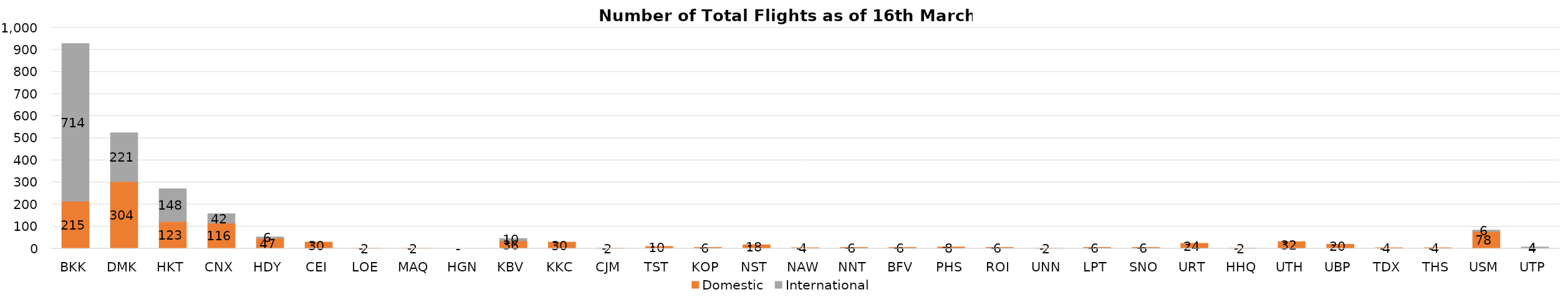
| Category | Domestic | International |
|---|---|---|
| BKK | 215 | 714 |
| DMK | 304 | 221 |
| HKT | 123 | 148 |
| CNX | 116 | 42 |
| HDY | 47 | 6 |
| CEI | 30 | 0 |
| LOE | 2 | 0 |
| MAQ | 2 | 0 |
| HGN | 0 | 0 |
| KBV | 36 | 10 |
| KKC | 30 | 0 |
| CJM | 2 | 0 |
| TST | 10 | 0 |
| KOP | 6 | 0 |
| NST | 18 | 0 |
| NAW | 4 | 0 |
| NNT | 6 | 0 |
| BFV | 6 | 0 |
| PHS | 8 | 0 |
| ROI | 6 | 0 |
| UNN | 2 | 0 |
| LPT | 6 | 0 |
| SNO | 6 | 0 |
| URT | 24 | 0 |
| HHQ | 2 | 0 |
| UTH | 32 | 0 |
| UBP | 20 | 0 |
| TDX | 4 | 0 |
| THS | 4 | 0 |
| USM | 78 | 6 |
| UTP | 4 | 4 |